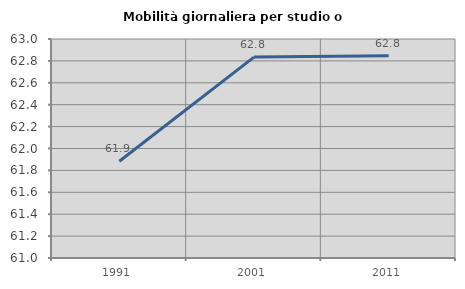
| Category | Mobilità giornaliera per studio o lavoro |
|---|---|
| 1991.0 | 61.883 |
| 2001.0 | 62.834 |
| 2011.0 | 62.847 |